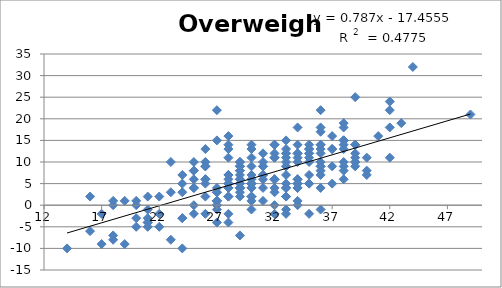
| Category | Overweight |
|---|---|
| 28.0 | 2 |
| 22.0 | -5 |
| 16.0 | -6 |
| 40.0 | 7 |
| 34.0 | 12 |
| 29.0 | 6 |
| 33.0 | 11 |
| 27.0 | 1 |
| 22.0 | -2 |
| 34.0 | 14 |
| 37.0 | 9 |
| 30.0 | 9 |
| 38.0 | 9 |
| 27.0 | 15 |
| 35.0 | 12 |
| 36.0 | 12 |
| 27.0 | 0 |
| 21.0 | -1 |
| 20.0 | 1 |
| 34.0 | 1 |
| 38.0 | 10 |
| 28.0 | 6 |
| 41.0 | 16 |
| 42.0 | 18 |
| 34.0 | 6 |
| 25.0 | 0 |
| 35.0 | -2 |
| 37.0 | 13 |
| 38.0 | 14 |
| 31.0 | 7 |
| 33.0 | 7 |
| 19.0 | -9 |
| 29.0 | 8 |
| 38.0 | 8 |
| 28.0 | 5 |
| 29.0 | 3 |
| 36.0 | 14 |
| 18.0 | -7 |
| 21.0 | -5 |
| 34.0 | 0 |
| 33.0 | -1 |
| 28.0 | 4 |
| 42.0 | 11 |
| 17.0 | -9 |
| 22.0 | 2 |
| 35.0 | 13 |
| 18.0 | 1 |
| 30.0 | 4 |
| 31.0 | 9 |
| 24.0 | -10 |
| 38.0 | 15 |
| 28.0 | -2 |
| 33.0 | 12 |
| 31.0 | 7 |
| 21.0 | 2 |
| 24.0 | 7 |
| 28.0 | 5 |
| 26.0 | 13 |
| 29.0 | 9 |
| 20.0 | -5 |
| 21.0 | -4 |
| 32.0 | 12 |
| 33.0 | 9 |
| 30.0 | 4 |
| 32.0 | 3 |
| 28.0 | 4 |
| 28.0 | 14 |
| 39.0 | 10 |
| 29.0 | 4 |
| 26.0 | 9 |
| 32.0 | 6 |
| 14.0 | -10 |
| 26.0 | 10 |
| 26.0 | -2 |
| 30.0 | 5 |
| 28.0 | 7 |
| 36.0 | 8 |
| 29.0 | 4 |
| 36.0 | 14 |
| 36.0 | 10 |
| 31.0 | 10 |
| 30.0 | 5 |
| 39.0 | 14 |
| 33.0 | 4 |
| 34.0 | 18 |
| 36.0 | 18 |
| 29.0 | 5 |
| 30.0 | -1 |
| 49.0 | 21 |
| 32.0 | 6 |
| 29.0 | 9 |
| 35.0 | 7 |
| 31.0 | 9 |
| 29.0 | 8 |
| 35.0 | 5 |
| 33.0 | 13 |
| 36.0 | 4 |
| 35.0 | 5 |
| 34.0 | 4 |
| 29.0 | 10 |
| 36.0 | 13 |
| 30.0 | 4 |
| 43.0 | 19 |
| 32.0 | 11 |
| 28.0 | 2 |
| 27.0 | 3 |
| 36.0 | 9 |
| 30.0 | 7 |
| 36.0 | 7 |
| 33.0 | -2 |
| 38.0 | 6 |
| 18.0 | -8 |
| 31.0 | 12 |
| 34.0 | 6 |
| 40.0 | 8 |
| 28.0 | 4 |
| 29.0 | -7 |
| 30.0 | 2 |
| 30.0 | 2 |
| 27.0 | -4 |
| 19.0 | 1 |
| 24.0 | -3 |
| 23.0 | 10 |
| 29.0 | 9 |
| 23.0 | -8 |
| 17.0 | -2 |
| 38.0 | 19 |
| 44.0 | 32 |
| 29.0 | 6 |
| 42.0 | 22 |
| 28.0 | 7 |
| 27.0 | 1 |
| 38.0 | 15 |
| 32.0 | 4 |
| 38.0 | 18 |
| 25.0 | 6 |
| 29.0 | 5 |
| 42.0 | 24 |
| 25.0 | 8 |
| 33.0 | 4 |
| 37.0 | 16 |
| 35.0 | 13 |
| 30.0 | 13 |
| 39.0 | 12 |
| 32.0 | -2 |
| 25.0 | 4 |
| 20.0 | 0 |
| 34.0 | 12 |
| 35.0 | 10 |
| 29.0 | 2 |
| 25.0 | 4 |
| 21.0 | -4 |
| 36.0 | -1 |
| 26.0 | 2 |
| 20.0 | -3 |
| 26.0 | 9 |
| 29.0 | 4 |
| 31.0 | 6 |
| 18.0 | 0 |
| 27.0 | 1 |
| 33.0 | 9 |
| 31.0 | 1 |
| 33.0 | 10 |
| 34.0 | 5 |
| 30.0 | 6 |
| 30.0 | 1 |
| 26.0 | 6 |
| 24.0 | -3 |
| 37.0 | 13 |
| 30.0 | 11 |
| 27.0 | 4 |
| 39.0 | 10 |
| 27.0 | 0 |
| 34.0 | 4 |
| 23.0 | 3 |
| 28.0 | 4 |
| 38.0 | 15 |
| 33.0 | 12 |
| 33.0 | 15 |
| 33.0 | 5 |
| 25.0 | 8 |
| 38.0 | 13 |
| 30.0 | 5 |
| 27.0 | 22 |
| 24.0 | 5 |
| 26.0 | 6 |
| 40.0 | 11 |
| 32.0 | 6 |
| 35.0 | 12 |
| 34.0 | 10 |
| 39.0 | 11 |
| 32.0 | 14 |
| 30.0 | 14 |
| 37.0 | 5 |
| 32.0 | 0 |
| 31.0 | 4 |
| 26.0 | 5 |
| 28.0 | -4 |
| 34.0 | 5 |
| 33.0 | 2 |
| 25.0 | 10 |
| 29.0 | 10 |
| 16.0 | 2 |
| 36.0 | 9 |
| 27.0 | -1 |
| 39.0 | 9 |
| 29.0 | 4 |
| 33.0 | 2 |
| 34.0 | 11 |
| 35.0 | 14 |
| 24.0 | 3 |
| 28.0 | 13 |
| 36.0 | 17 |
| 39.0 | 25 |
| 29.0 | 7 |
| 28.0 | 11 |
| 27.0 | 3 |
| 21.0 | -3 |
| 35.0 | 11 |
| 25.0 | -2 |
| 32.0 | 14 |
| 36.0 | 22 |
| 28.0 | 16 |
| 39.0 | 14 |
| 32.0 | 11 |